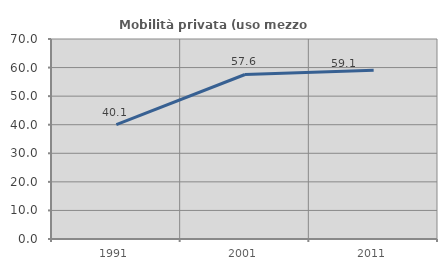
| Category | Mobilità privata (uso mezzo privato) |
|---|---|
| 1991.0 | 40.056 |
| 2001.0 | 57.576 |
| 2011.0 | 59.073 |